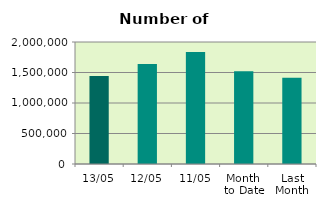
| Category | Series 0 |
|---|---|
| 13/05 | 1443330 |
| 12/05 | 1640664 |
| 11/05 | 1837094 |
| Month 
to Date | 1522380.222 |
| Last
Month | 1414476.2 |